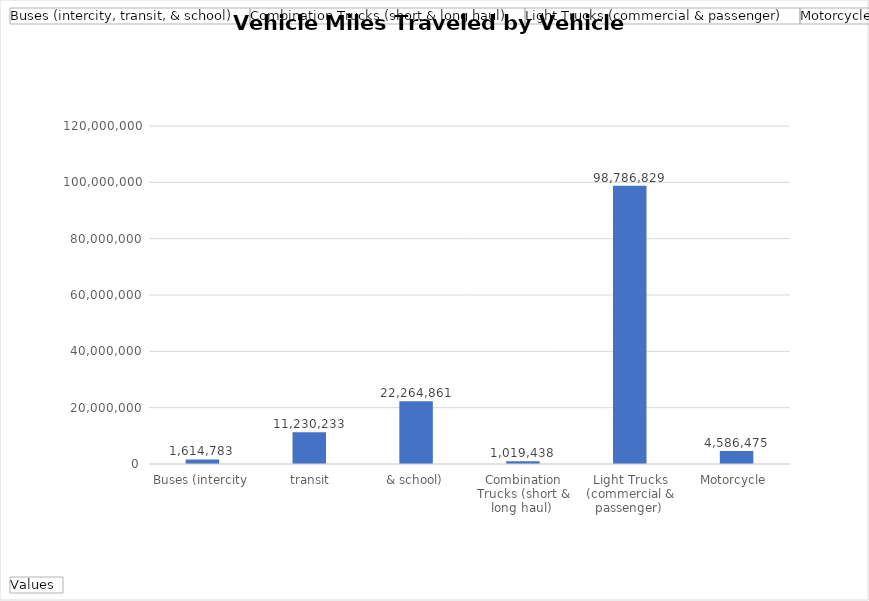
| Category | Total |
|---|---|
| Buses (intercity, transit, & school)  | 1614783 |
| Combination Trucks (short & long haul)  | 11230233 |
| Light Trucks (commercial & passenger)  | 22264861 |
| Motorcycle  | 1019438 |
| Passenger Car  | 98786829 |
| Single Unit Trucks (refuse, short & long haul) and Motorhomes  | 4586475 |